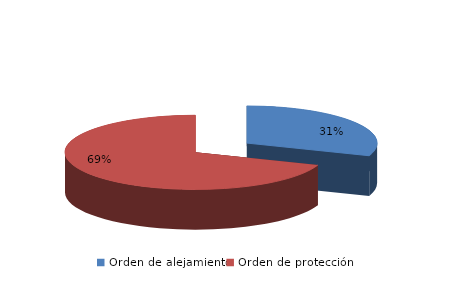
| Category | Series 0 |
|---|---|
| Orden de alejamiento | 194 |
| Orden de protección | 441 |